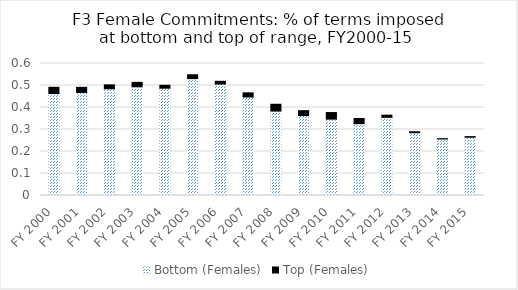
| Category | Bottom (Females) | Top (Females) |
|---|---|---|
| FY 2000 | 0.463 | 0.029 |
| FY 2001 | 0.468 | 0.023 |
| FY 2002 | 0.485 | 0.018 |
| FY 2003 | 0.494 | 0.02 |
| FY 2004 | 0.488 | 0.014 |
| FY 2005 | 0.531 | 0.018 |
| FY 2006 | 0.506 | 0.013 |
| FY 2007 | 0.448 | 0.019 |
| FY 2008 | 0.384 | 0.031 |
| FY 2009 | 0.363 | 0.022 |
| FY 2010 | 0.347 | 0.03 |
| FY 2011 | 0.327 | 0.024 |
| FY 2012 | 0.355 | 0.01 |
| FY 2013 | 0.285 | 0.004 |
| FY 2014 | 0.257 | 0.001 |
| FY 2015 | 0.265 | 0.003 |